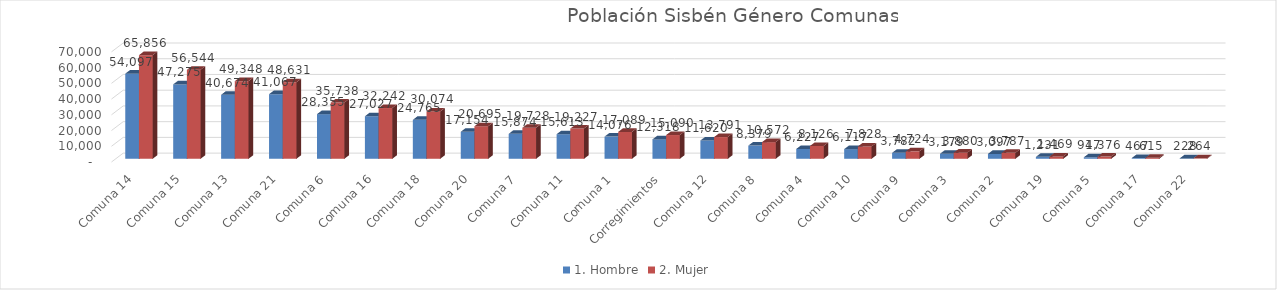
| Category | 1. Hombre | 2. Mujer |
|---|---|---|
| Comuna 14 | 54097 | 65856 |
| Comuna 15 | 47275 | 56544 |
| Comuna 13 | 40674 | 49348 |
| Comuna 21 | 41067 | 48631 |
| Comuna 6 | 28355 | 35738 |
| Comuna 16 | 27027 | 32242 |
| Comuna 18 | 24765 | 30074 |
| Comuna 20 | 17154 | 20695 |
| Comuna 7 | 15874 | 19728 |
| Comuna 11 | 15613 | 19227 |
| Comuna 1 | 14076 | 17089 |
| Corregimientos | 12318 | 15090 |
| Comuna 12 | 11620 | 13791 |
| Comuna 8 | 8379 | 10572 |
| Comuna 4 | 6227 | 8126 |
| Comuna 10 | 6117 | 7828 |
| Comuna 9 | 3782 | 4724 |
| Comuna 3 | 3179 | 3880 |
| Comuna 2 | 3097 | 3787 |
| Comuna 19 | 1231 | 1469 |
| Comuna 5 | 947 | 1376 |
| Comuna 17 | 467 | 615 |
| Comuna 22 | 228 | 264 |